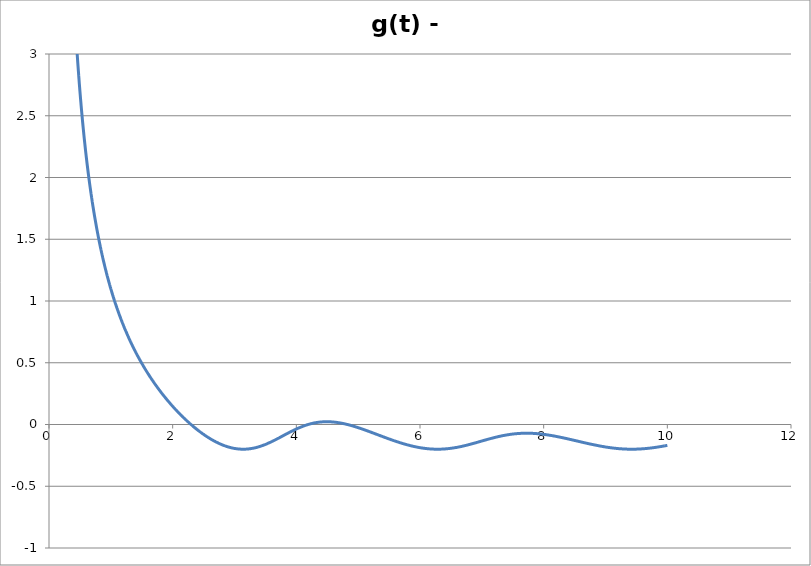
| Category | g(t) - 1/5 |
|---|---|
| 0.01 | 149.798 |
| 0.02 | 74.796 |
| 0.03 | 49.794 |
| 0.04 | 37.292 |
| 0.05 | 29.79 |
| 0.06 | 24.788 |
| 0.07 | 21.215 |
| 0.08 | 18.534 |
| 0.09 | 16.449 |
| 0.1 | 14.78 |
| 0.11 | 13.414 |
| 0.12 | 12.276 |
| 0.13 | 11.312 |
| 0.14 | 10.486 |
| 0.15 | 9.77 |
| 0.16 | 9.143 |
| 0.17 | 8.59 |
| 0.18 | 8.097 |
| 0.19 | 7.657 |
| 0.2 | 7.26 |
| 0.21 | 6.901 |
| 0.22 | 6.574 |
| 0.23 | 6.276 |
| 0.24 | 6.002 |
| 0.25 | 5.75 |
| 0.26 | 5.517 |
| 0.27 | 5.302 |
| 0.28 | 5.101 |
| 0.29 | 4.914 |
| 0.3 | 4.74 |
| 0.31 | 4.577 |
| 0.32 | 4.423 |
| 0.33 | 4.279 |
| 0.34 | 4.144 |
| 0.35 | 4.016 |
| 0.36 | 3.895 |
| 0.37 | 3.78 |
| 0.38 | 3.671 |
| 0.39 | 3.568 |
| 0.4 | 3.47 |
| 0.41 | 3.376 |
| 0.42 | 3.287 |
| 0.43 | 3.202 |
| 0.44 | 3.121 |
| 0.45 | 3.043 |
| 0.46 | 2.969 |
| 0.47 | 2.897 |
| 0.48 | 2.829 |
| 0.49 | 2.763 |
| 0.5 | 2.7 |
| 0.51 | 2.639 |
| 0.52 | 2.58 |
| 0.53 | 2.524 |
| 0.54 | 2.469 |
| 0.55 | 2.417 |
| 0.56 | 2.366 |
| 0.57 | 2.317 |
| 0.58 | 2.27 |
| 0.59 | 2.224 |
| 0.6 | 2.18 |
| 0.61 | 2.137 |
| 0.62 | 2.095 |
| 0.63 | 2.055 |
| 0.64 | 2.015 |
| 0.65 | 1.977 |
| 0.66 | 1.94 |
| 0.67 | 1.904 |
| 0.68 | 1.869 |
| 0.69 | 1.835 |
| 0.7 | 1.802 |
| 0.71 | 1.77 |
| 0.72 | 1.739 |
| 0.73 | 1.708 |
| 0.74 | 1.678 |
| 0.75 | 1.649 |
| 0.76 | 1.621 |
| 0.77 | 1.593 |
| 0.78 | 1.566 |
| 0.79 | 1.54 |
| 0.8 | 1.514 |
| 0.81 | 1.489 |
| 0.82 | 1.464 |
| 0.83 | 1.44 |
| 0.84 | 1.417 |
| 0.85 | 1.394 |
| 0.86 | 1.371 |
| 0.87 | 1.349 |
| 0.88 | 1.327 |
| 0.89 | 1.306 |
| 0.9 | 1.285 |
| 0.91 | 1.265 |
| 0.92 | 1.245 |
| 0.93 | 1.226 |
| 0.94 | 1.206 |
| 0.95 | 1.188 |
| 0.96 | 1.169 |
| 0.97 | 1.151 |
| 0.98 | 1.133 |
| 0.99 | 1.116 |
| 1.0 | 1.098 |
| 1.01 | 1.081 |
| 1.02 | 1.065 |
| 1.03 | 1.049 |
| 1.04 | 1.033 |
| 1.05 | 1.017 |
| 1.06 | 1.001 |
| 1.07 | 0.986 |
| 1.08 | 0.971 |
| 1.09 | 0.956 |
| 1.1 | 0.942 |
| 1.11 | 0.927 |
| 1.12 | 0.913 |
| 1.13 | 0.899 |
| 1.14 | 0.886 |
| 1.15 | 0.872 |
| 1.16 | 0.859 |
| 1.17 | 0.846 |
| 1.18 | 0.833 |
| 1.19 | 0.82 |
| 1.2 | 0.807 |
| 1.21 | 0.795 |
| 1.22 | 0.783 |
| 1.23 | 0.771 |
| 1.24 | 0.759 |
| 1.25 | 0.747 |
| 1.26 | 0.736 |
| 1.27 | 0.724 |
| 1.28 | 0.713 |
| 1.29 | 0.702 |
| 1.3 | 0.691 |
| 1.31 | 0.68 |
| 1.32 | 0.669 |
| 1.33 | 0.659 |
| 1.34 | 0.648 |
| 1.35 | 0.638 |
| 1.36 | 0.628 |
| 1.37 | 0.618 |
| 1.38 | 0.608 |
| 1.39 | 0.598 |
| 1.4 | 0.588 |
| 1.41 | 0.578 |
| 1.42 | 0.569 |
| 1.43 | 0.559 |
| 1.44 | 0.55 |
| 1.45 | 0.541 |
| 1.46 | 0.532 |
| 1.47 | 0.523 |
| 1.48 | 0.514 |
| 1.49 | 0.505 |
| 1.5 | 0.496 |
| 1.51 | 0.487 |
| 1.52 | 0.479 |
| 1.53 | 0.47 |
| 1.54 | 0.462 |
| 1.55 | 0.454 |
| 1.56 | 0.445 |
| 1.57 | 0.437 |
| 1.58 | 0.429 |
| 1.59 | 0.421 |
| 1.6 | 0.413 |
| 1.61 | 0.405 |
| 1.62 | 0.398 |
| 1.63 | 0.39 |
| 1.64 | 0.382 |
| 1.65 | 0.375 |
| 1.66 | 0.367 |
| 1.67 | 0.36 |
| 1.68 | 0.353 |
| 1.69 | 0.345 |
| 1.7 | 0.338 |
| 1.71 | 0.331 |
| 1.72 | 0.324 |
| 1.73 | 0.317 |
| 1.74 | 0.31 |
| 1.75 | 0.303 |
| 1.76 | 0.296 |
| 1.77 | 0.289 |
| 1.78 | 0.282 |
| 1.79 | 0.276 |
| 1.8 | 0.269 |
| 1.81 | 0.263 |
| 1.82 | 0.256 |
| 1.83 | 0.25 |
| 1.84 | 0.243 |
| 1.85 | 0.237 |
| 1.86 | 0.231 |
| 1.87 | 0.224 |
| 1.88 | 0.218 |
| 1.89 | 0.212 |
| 1.9 | 0.206 |
| 1.91 | 0.2 |
| 1.92 | 0.194 |
| 1.93 | 0.188 |
| 1.94 | 0.182 |
| 1.95 | 0.176 |
| 1.96 | 0.17 |
| 1.97 | 0.165 |
| 1.98 | 0.159 |
| 1.99 | 0.153 |
| 2.0 | 0.148 |
| 2.01 | 0.142 |
| 2.02 | 0.137 |
| 2.03 | 0.131 |
| 2.04 | 0.126 |
| 2.05 | 0.12 |
| 2.06 | 0.115 |
| 2.07 | 0.11 |
| 2.08 | 0.104 |
| 2.09 | 0.099 |
| 2.1 | 0.094 |
| 2.11 | 0.089 |
| 2.12 | 0.084 |
| 2.13 | 0.079 |
| 2.14 | 0.074 |
| 2.15 | 0.069 |
| 2.16 | 0.064 |
| 2.17 | 0.059 |
| 2.18 | 0.054 |
| 2.19 | 0.049 |
| 2.2 | 0.044 |
| 2.21 | 0.04 |
| 2.22 | 0.035 |
| 2.23 | 0.03 |
| 2.24 | 0.026 |
| 2.25 | 0.021 |
| 2.26 | 0.017 |
| 2.27 | 0.012 |
| 2.28 | 0.008 |
| 2.29 | 0.003 |
| 2.3 | -0.001 |
| 2.31 | -0.006 |
| 2.32 | -0.01 |
| 2.33 | -0.014 |
| 2.34 | -0.018 |
| 2.35 | -0.022 |
| 2.36 | -0.027 |
| 2.37 | -0.031 |
| 2.38 | -0.035 |
| 2.39 | -0.039 |
| 2.4 | -0.043 |
| 2.41 | -0.046 |
| 2.42 | -0.05 |
| 2.43 | -0.054 |
| 2.44 | -0.058 |
| 2.45 | -0.062 |
| 2.46 | -0.065 |
| 2.47 | -0.069 |
| 2.48 | -0.073 |
| 2.49 | -0.076 |
| 2.5 | -0.08 |
| 2.51 | -0.083 |
| 2.52 | -0.087 |
| 2.53 | -0.09 |
| 2.54 | -0.093 |
| 2.55 | -0.097 |
| 2.56 | -0.1 |
| 2.57 | -0.103 |
| 2.58 | -0.106 |
| 2.59 | -0.11 |
| 2.6 | -0.113 |
| 2.61 | -0.116 |
| 2.62 | -0.119 |
| 2.63 | -0.122 |
| 2.64 | -0.124 |
| 2.65 | -0.127 |
| 2.66 | -0.13 |
| 2.67 | -0.133 |
| 2.68 | -0.136 |
| 2.69 | -0.138 |
| 2.7 | -0.141 |
| 2.71 | -0.143 |
| 2.72 | -0.146 |
| 2.73 | -0.148 |
| 2.74 | -0.151 |
| 2.75 | -0.153 |
| 2.76 | -0.155 |
| 2.77 | -0.158 |
| 2.78 | -0.16 |
| 2.79 | -0.162 |
| 2.8 | -0.164 |
| 2.81 | -0.166 |
| 2.82 | -0.168 |
| 2.83 | -0.17 |
| 2.84 | -0.172 |
| 2.85 | -0.174 |
| 2.86 | -0.175 |
| 2.87 | -0.177 |
| 2.88 | -0.179 |
| 2.89 | -0.18 |
| 2.9 | -0.182 |
| 2.91 | -0.183 |
| 2.92 | -0.185 |
| 2.93 | -0.186 |
| 2.94 | -0.187 |
| 2.95 | -0.188 |
| 2.96 | -0.19 |
| 2.97 | -0.191 |
| 2.98 | -0.192 |
| 2.99 | -0.193 |
| 3.0 | -0.194 |
| 3.01 | -0.195 |
| 3.02 | -0.195 |
| 3.03 | -0.196 |
| 3.04 | -0.197 |
| 3.05 | -0.197 |
| 3.06 | -0.198 |
| 3.07 | -0.198 |
| 3.08 | -0.199 |
| 3.09 | -0.199 |
| 3.1 | -0.199 |
| 3.11 | -0.2 |
| 3.12 | -0.2 |
| 3.13 | -0.2 |
| 3.14 | -0.2 |
| 3.15 | -0.2 |
| 3.16 | -0.2 |
| 3.17 | -0.2 |
| 3.18 | -0.2 |
| 3.19 | -0.199 |
| 3.2 | -0.199 |
| 3.21 | -0.199 |
| 3.22 | -0.198 |
| 3.23 | -0.198 |
| 3.24 | -0.197 |
| 3.25 | -0.196 |
| 3.26 | -0.196 |
| 3.27 | -0.195 |
| 3.28 | -0.194 |
| 3.29 | -0.193 |
| 3.3 | -0.192 |
| 3.31 | -0.191 |
| 3.32 | -0.19 |
| 3.33 | -0.189 |
| 3.34 | -0.188 |
| 3.35 | -0.186 |
| 3.36 | -0.185 |
| 3.37 | -0.184 |
| 3.38 | -0.182 |
| 3.39 | -0.181 |
| 3.4 | -0.179 |
| 3.41 | -0.178 |
| 3.42 | -0.176 |
| 3.43 | -0.174 |
| 3.44 | -0.173 |
| 3.45 | -0.171 |
| 3.46 | -0.169 |
| 3.47 | -0.167 |
| 3.48 | -0.165 |
| 3.49 | -0.163 |
| 3.5 | -0.161 |
| 3.51 | -0.159 |
| 3.52 | -0.157 |
| 3.53 | -0.155 |
| 3.54 | -0.153 |
| 3.55 | -0.15 |
| 3.56 | -0.148 |
| 3.57 | -0.146 |
| 3.58 | -0.144 |
| 3.59 | -0.141 |
| 3.6 | -0.139 |
| 3.61 | -0.136 |
| 3.62 | -0.134 |
| 3.63 | -0.132 |
| 3.64 | -0.129 |
| 3.65 | -0.127 |
| 3.66 | -0.124 |
| 3.67 | -0.121 |
| 3.68 | -0.119 |
| 3.69 | -0.116 |
| 3.7 | -0.114 |
| 3.71 | -0.111 |
| 3.72 | -0.108 |
| 3.73 | -0.106 |
| 3.74 | -0.103 |
| 3.75 | -0.1 |
| 3.76 | -0.098 |
| 3.77 | -0.095 |
| 3.78 | -0.092 |
| 3.79 | -0.09 |
| 3.8 | -0.087 |
| 3.81 | -0.084 |
| 3.82 | -0.082 |
| 3.83 | -0.079 |
| 3.84 | -0.076 |
| 3.85 | -0.074 |
| 3.86 | -0.071 |
| 3.87 | -0.069 |
| 3.88 | -0.066 |
| 3.89 | -0.063 |
| 3.9 | -0.061 |
| 3.91 | -0.058 |
| 3.92 | -0.056 |
| 3.93 | -0.053 |
| 3.94 | -0.051 |
| 3.95 | -0.048 |
| 3.96 | -0.046 |
| 3.97 | -0.044 |
| 3.98 | -0.041 |
| 3.99 | -0.039 |
| 4.0 | -0.037 |
| 4.01 | -0.034 |
| 4.02 | -0.032 |
| 4.03 | -0.03 |
| 4.04 | -0.028 |
| 4.05 | -0.026 |
| 4.06 | -0.023 |
| 4.07 | -0.021 |
| 4.08 | -0.019 |
| 4.09 | -0.017 |
| 4.1 | -0.016 |
| 4.11 | -0.014 |
| 4.12 | -0.012 |
| 4.13 | -0.01 |
| 4.14 | -0.008 |
| 4.15 | -0.007 |
| 4.16 | -0.005 |
| 4.17 | -0.003 |
| 4.18 | -0.002 |
| 4.19 | 0 |
| 4.2 | 0.001 |
| 4.21 | 0.003 |
| 4.22 | 0.004 |
| 4.23 | 0.005 |
| 4.24 | 0.007 |
| 4.25 | 0.008 |
| 4.26 | 0.009 |
| 4.27 | 0.01 |
| 4.28 | 0.011 |
| 4.29 | 0.012 |
| 4.3 | 0.013 |
| 4.31 | 0.014 |
| 4.32 | 0.015 |
| 4.33 | 0.016 |
| 4.34 | 0.017 |
| 4.35 | 0.018 |
| 4.36 | 0.018 |
| 4.37 | 0.019 |
| 4.38 | 0.019 |
| 4.39 | 0.02 |
| 4.4 | 0.02 |
| 4.41 | 0.021 |
| 4.42 | 0.021 |
| 4.43 | 0.022 |
| 4.44 | 0.022 |
| 4.45 | 0.022 |
| 4.46 | 0.022 |
| 4.47 | 0.022 |
| 4.48 | 0.023 |
| 4.49 | 0.023 |
| 4.5 | 0.023 |
| 4.51 | 0.022 |
| 4.52 | 0.022 |
| 4.53 | 0.022 |
| 4.54 | 0.022 |
| 4.55 | 0.022 |
| 4.56 | 0.022 |
| 4.57 | 0.021 |
| 4.58 | 0.021 |
| 4.59 | 0.02 |
| 4.6 | 0.02 |
| 4.61 | 0.019 |
| 4.62 | 0.019 |
| 4.63 | 0.018 |
| 4.64 | 0.018 |
| 4.65 | 0.017 |
| 4.66 | 0.016 |
| 4.67 | 0.016 |
| 4.68 | 0.015 |
| 4.69 | 0.014 |
| 4.7 | 0.013 |
| 4.71 | 0.012 |
| 4.72 | 0.012 |
| 4.73 | 0.011 |
| 4.74 | 0.01 |
| 4.75 | 0.009 |
| 4.76 | 0.008 |
| 4.77 | 0.006 |
| 4.78 | 0.005 |
| 4.79 | 0.004 |
| 4.8 | 0.003 |
| 4.81 | 0.002 |
| 4.82 | 0.001 |
| 4.83 | -0.001 |
| 4.84 | -0.002 |
| 4.85 | -0.003 |
| 4.86 | -0.005 |
| 4.87 | -0.006 |
| 4.88 | -0.007 |
| 4.89 | -0.009 |
| 4.9 | -0.01 |
| 4.91 | -0.012 |
| 4.92 | -0.013 |
| 4.93 | -0.015 |
| 4.94 | -0.016 |
| 4.95 | -0.018 |
| 4.96 | -0.019 |
| 4.97 | -0.021 |
| 4.98 | -0.022 |
| 4.99 | -0.024 |
| 5.0 | -0.026 |
| 5.01 | -0.027 |
| 5.02 | -0.029 |
| 5.03 | -0.031 |
| 5.04 | -0.032 |
| 5.05 | -0.034 |
| 5.06 | -0.036 |
| 5.07 | -0.037 |
| 5.08 | -0.039 |
| 5.09 | -0.041 |
| 5.1 | -0.043 |
| 5.11 | -0.045 |
| 5.12 | -0.046 |
| 5.13 | -0.048 |
| 5.14 | -0.05 |
| 5.15 | -0.052 |
| 5.16 | -0.054 |
| 5.17 | -0.055 |
| 5.18 | -0.057 |
| 5.19 | -0.059 |
| 5.2 | -0.061 |
| 5.21 | -0.063 |
| 5.22 | -0.065 |
| 5.23 | -0.067 |
| 5.24 | -0.068 |
| 5.25 | -0.07 |
| 5.26 | -0.072 |
| 5.27 | -0.074 |
| 5.28 | -0.076 |
| 5.29 | -0.078 |
| 5.3 | -0.08 |
| 5.31 | -0.082 |
| 5.32 | -0.084 |
| 5.33 | -0.085 |
| 5.34 | -0.087 |
| 5.35 | -0.089 |
| 5.36 | -0.091 |
| 5.37 | -0.093 |
| 5.38 | -0.095 |
| 5.39 | -0.097 |
| 5.4 | -0.099 |
| 5.41 | -0.1 |
| 5.42 | -0.102 |
| 5.43 | -0.104 |
| 5.44 | -0.106 |
| 5.45 | -0.108 |
| 5.46 | -0.11 |
| 5.47 | -0.112 |
| 5.48 | -0.113 |
| 5.49 | -0.115 |
| 5.5 | -0.117 |
| 5.51 | -0.119 |
| 5.52 | -0.121 |
| 5.53 | -0.122 |
| 5.54 | -0.124 |
| 5.55 | -0.126 |
| 5.56 | -0.128 |
| 5.57 | -0.129 |
| 5.58 | -0.131 |
| 5.59 | -0.133 |
| 5.6 | -0.135 |
| 5.61 | -0.136 |
| 5.62 | -0.138 |
| 5.63 | -0.14 |
| 5.64 | -0.141 |
| 5.65 | -0.143 |
| 5.66 | -0.144 |
| 5.67 | -0.146 |
| 5.68 | -0.148 |
| 5.69 | -0.149 |
| 5.7 | -0.151 |
| 5.71 | -0.152 |
| 5.72 | -0.154 |
| 5.73 | -0.155 |
| 5.74 | -0.157 |
| 5.75 | -0.158 |
| 5.76 | -0.16 |
| 5.77 | -0.161 |
| 5.78 | -0.163 |
| 5.79 | -0.164 |
| 5.8 | -0.165 |
| 5.81 | -0.167 |
| 5.82 | -0.168 |
| 5.83 | -0.169 |
| 5.84 | -0.17 |
| 5.85 | -0.172 |
| 5.86 | -0.173 |
| 5.87 | -0.174 |
| 5.88 | -0.175 |
| 5.89 | -0.176 |
| 5.9 | -0.178 |
| 5.91 | -0.179 |
| 5.92 | -0.18 |
| 5.93 | -0.181 |
| 5.94 | -0.182 |
| 5.95 | -0.183 |
| 5.96 | -0.184 |
| 5.97 | -0.185 |
| 5.98 | -0.186 |
| 5.99 | -0.187 |
| 6.0 | -0.188 |
| 6.01 | -0.188 |
| 6.02 | -0.189 |
| 6.03 | -0.19 |
| 6.04 | -0.191 |
| 6.05 | -0.191 |
| 6.06 | -0.192 |
| 6.07 | -0.193 |
| 6.08 | -0.194 |
| 6.09 | -0.194 |
| 6.1 | -0.195 |
| 6.11 | -0.195 |
| 6.12 | -0.196 |
| 6.13 | -0.196 |
| 6.14 | -0.197 |
| 6.15 | -0.197 |
| 6.16 | -0.198 |
| 6.17 | -0.198 |
| 6.18 | -0.198 |
| 6.19 | -0.199 |
| 6.2 | -0.199 |
| 6.21 | -0.199 |
| 6.22 | -0.199 |
| 6.23 | -0.2 |
| 6.24 | -0.2 |
| 6.25 | -0.2 |
| 6.26 | -0.2 |
| 6.27 | -0.2 |
| 6.28 | -0.2 |
| 6.29 | -0.2 |
| 6.3 | -0.2 |
| 6.31 | -0.2 |
| 6.32 | -0.2 |
| 6.33 | -0.2 |
| 6.34 | -0.199 |
| 6.35 | -0.199 |
| 6.36 | -0.199 |
| 6.37 | -0.199 |
| 6.38 | -0.199 |
| 6.39 | -0.198 |
| 6.4 | -0.198 |
| 6.41 | -0.197 |
| 6.42 | -0.197 |
| 6.43 | -0.197 |
| 6.44 | -0.196 |
| 6.45 | -0.196 |
| 6.46 | -0.195 |
| 6.47 | -0.195 |
| 6.48 | -0.194 |
| 6.49 | -0.193 |
| 6.5 | -0.193 |
| 6.51 | -0.192 |
| 6.52 | -0.191 |
| 6.53 | -0.191 |
| 6.54 | -0.19 |
| 6.55 | -0.189 |
| 6.56 | -0.188 |
| 6.57 | -0.187 |
| 6.58 | -0.186 |
| 6.59 | -0.186 |
| 6.6 | -0.185 |
| 6.61 | -0.184 |
| 6.62 | -0.183 |
| 6.63 | -0.182 |
| 6.64 | -0.181 |
| 6.65 | -0.18 |
| 6.66 | -0.179 |
| 6.67 | -0.177 |
| 6.68 | -0.176 |
| 6.69 | -0.175 |
| 6.7 | -0.174 |
| 6.71 | -0.173 |
| 6.72 | -0.172 |
| 6.73 | -0.171 |
| 6.74 | -0.169 |
| 6.75 | -0.168 |
| 6.76 | -0.167 |
| 6.77 | -0.166 |
| 6.78 | -0.164 |
| 6.79 | -0.163 |
| 6.8 | -0.162 |
| 6.81 | -0.16 |
| 6.82 | -0.159 |
| 6.83 | -0.158 |
| 6.84 | -0.156 |
| 6.85 | -0.155 |
| 6.86 | -0.154 |
| 6.87 | -0.152 |
| 6.88 | -0.151 |
| 6.89 | -0.149 |
| 6.9 | -0.148 |
| 6.91 | -0.147 |
| 6.92 | -0.145 |
| 6.93 | -0.144 |
| 6.94 | -0.142 |
| 6.95 | -0.141 |
| 6.96 | -0.139 |
| 6.97 | -0.138 |
| 6.98 | -0.137 |
| 6.99 | -0.135 |
| 7.0 | -0.134 |
| 7.01 | -0.132 |
| 7.02 | -0.131 |
| 7.03 | -0.129 |
| 7.04 | -0.128 |
| 7.05 | -0.127 |
| 7.06 | -0.125 |
| 7.07 | -0.124 |
| 7.08 | -0.122 |
| 7.09 | -0.121 |
| 7.1 | -0.119 |
| 7.11 | -0.118 |
| 7.12 | -0.117 |
| 7.13 | -0.115 |
| 7.14 | -0.114 |
| 7.15 | -0.113 |
| 7.16 | -0.111 |
| 7.17 | -0.11 |
| 7.18 | -0.109 |
| 7.19 | -0.107 |
| 7.2 | -0.106 |
| 7.21 | -0.105 |
| 7.22 | -0.104 |
| 7.23 | -0.103 |
| 7.24 | -0.101 |
| 7.25 | -0.1 |
| 7.26 | -0.099 |
| 7.27 | -0.098 |
| 7.28 | -0.097 |
| 7.29 | -0.096 |
| 7.3 | -0.094 |
| 7.31 | -0.093 |
| 7.32 | -0.092 |
| 7.33 | -0.091 |
| 7.34 | -0.09 |
| 7.35 | -0.089 |
| 7.36 | -0.088 |
| 7.37 | -0.087 |
| 7.38 | -0.086 |
| 7.39 | -0.086 |
| 7.4 | -0.085 |
| 7.41 | -0.084 |
| 7.42 | -0.083 |
| 7.43 | -0.082 |
| 7.44 | -0.081 |
| 7.45 | -0.081 |
| 7.46 | -0.08 |
| 7.47 | -0.079 |
| 7.48 | -0.079 |
| 7.49 | -0.078 |
| 7.5 | -0.077 |
| 7.51 | -0.077 |
| 7.52 | -0.076 |
| 7.53 | -0.076 |
| 7.54 | -0.075 |
| 7.55 | -0.075 |
| 7.56 | -0.074 |
| 7.57 | -0.074 |
| 7.58 | -0.073 |
| 7.59 | -0.073 |
| 7.6 | -0.073 |
| 7.61 | -0.072 |
| 7.62 | -0.072 |
| 7.63 | -0.072 |
| 7.64 | -0.072 |
| 7.65 | -0.071 |
| 7.66 | -0.071 |
| 7.67 | -0.071 |
| 7.68 | -0.071 |
| 7.69 | -0.071 |
| 7.7 | -0.071 |
| 7.71 | -0.071 |
| 7.72 | -0.071 |
| 7.73 | -0.071 |
| 7.74 | -0.071 |
| 7.75 | -0.071 |
| 7.76 | -0.071 |
| 7.77 | -0.071 |
| 7.78 | -0.071 |
| 7.79 | -0.071 |
| 7.8 | -0.071 |
| 7.81 | -0.071 |
| 7.82 | -0.072 |
| 7.83 | -0.072 |
| 7.84 | -0.072 |
| 7.85 | -0.073 |
| 7.86 | -0.073 |
| 7.87 | -0.073 |
| 7.88 | -0.074 |
| 7.89 | -0.074 |
| 7.9 | -0.074 |
| 7.91 | -0.075 |
| 7.92 | -0.075 |
| 7.93 | -0.076 |
| 7.94 | -0.076 |
| 7.95 | -0.077 |
| 7.96 | -0.077 |
| 7.97 | -0.078 |
| 7.98 | -0.079 |
| 7.99 | -0.079 |
| 8.0 | -0.08 |
| 8.01 | -0.08 |
| 8.02 | -0.081 |
| 8.03 | -0.082 |
| 8.04 | -0.083 |
| 8.05 | -0.083 |
| 8.06 | -0.084 |
| 8.07 | -0.085 |
| 8.08 | -0.086 |
| 8.09 | -0.086 |
| 8.1 | -0.087 |
| 8.11 | -0.088 |
| 8.12 | -0.089 |
| 8.13 | -0.09 |
| 8.14 | -0.091 |
| 8.15 | -0.091 |
| 8.16 | -0.092 |
| 8.17 | -0.093 |
| 8.18 | -0.094 |
| 8.19 | -0.095 |
| 8.2 | -0.096 |
| 8.21 | -0.097 |
| 8.22 | -0.098 |
| 8.23 | -0.099 |
| 8.24 | -0.1 |
| 8.25 | -0.101 |
| 8.26 | -0.102 |
| 8.27 | -0.103 |
| 8.28 | -0.104 |
| 8.29 | -0.105 |
| 8.3 | -0.106 |
| 8.31 | -0.107 |
| 8.32 | -0.108 |
| 8.33 | -0.11 |
| 8.34 | -0.111 |
| 8.35 | -0.112 |
| 8.36 | -0.113 |
| 8.37 | -0.114 |
| 8.38 | -0.115 |
| 8.39 | -0.116 |
| 8.4 | -0.117 |
| 8.41 | -0.119 |
| 8.42 | -0.12 |
| 8.43 | -0.121 |
| 8.44 | -0.122 |
| 8.45 | -0.123 |
| 8.46 | -0.124 |
| 8.47 | -0.125 |
| 8.48 | -0.127 |
| 8.49 | -0.128 |
| 8.5 | -0.129 |
| 8.51 | -0.13 |
| 8.52 | -0.131 |
| 8.53 | -0.133 |
| 8.54 | -0.134 |
| 8.55 | -0.135 |
| 8.56 | -0.136 |
| 8.57 | -0.137 |
| 8.58 | -0.138 |
| 8.59 | -0.14 |
| 8.6 | -0.141 |
| 8.61 | -0.142 |
| 8.62 | -0.143 |
| 8.63 | -0.144 |
| 8.64 | -0.145 |
| 8.65 | -0.147 |
| 8.66 | -0.148 |
| 8.67 | -0.149 |
| 8.68 | -0.15 |
| 8.69 | -0.151 |
| 8.7 | -0.152 |
| 8.71 | -0.153 |
| 8.72 | -0.154 |
| 8.73 | -0.156 |
| 8.74 | -0.157 |
| 8.75 | -0.158 |
| 8.76 | -0.159 |
| 8.77 | -0.16 |
| 8.78 | -0.161 |
| 8.79 | -0.162 |
| 8.8 | -0.163 |
| 8.81 | -0.164 |
| 8.82 | -0.165 |
| 8.83 | -0.166 |
| 8.84 | -0.167 |
| 8.85 | -0.168 |
| 8.86 | -0.169 |
| 8.87 | -0.17 |
| 8.88 | -0.171 |
| 8.89 | -0.172 |
| 8.9 | -0.173 |
| 8.91 | -0.174 |
| 8.92 | -0.175 |
| 8.93 | -0.176 |
| 8.94 | -0.177 |
| 8.95 | -0.178 |
| 8.96 | -0.179 |
| 8.97 | -0.179 |
| 8.98 | -0.18 |
| 8.99 | -0.181 |
| 9.0 | -0.182 |
| 9.01 | -0.183 |
| 9.02 | -0.183 |
| 9.03 | -0.184 |
| 9.04 | -0.185 |
| 9.05 | -0.186 |
| 9.06 | -0.186 |
| 9.07 | -0.187 |
| 9.08 | -0.188 |
| 9.09 | -0.189 |
| 9.1 | -0.189 |
| 9.11 | -0.19 |
| 9.12 | -0.19 |
| 9.13 | -0.191 |
| 9.14 | -0.192 |
| 9.15 | -0.192 |
| 9.16 | -0.193 |
| 9.17 | -0.193 |
| 9.18 | -0.194 |
| 9.19 | -0.194 |
| 9.2 | -0.195 |
| 9.21 | -0.195 |
| 9.22 | -0.196 |
| 9.23 | -0.196 |
| 9.24 | -0.196 |
| 9.25 | -0.197 |
| 9.26 | -0.197 |
| 9.27 | -0.197 |
| 9.28 | -0.198 |
| 9.29 | -0.198 |
| 9.3 | -0.198 |
| 9.31 | -0.199 |
| 9.32 | -0.199 |
| 9.33 | -0.199 |
| 9.34 | -0.199 |
| 9.35 | -0.199 |
| 9.36 | -0.2 |
| 9.37 | -0.2 |
| 9.38 | -0.2 |
| 9.39 | -0.2 |
| 9.4 | -0.2 |
| 9.41 | -0.2 |
| 9.42 | -0.2 |
| 9.43 | -0.2 |
| 9.44 | -0.2 |
| 9.45 | -0.2 |
| 9.46 | -0.2 |
| 9.47 | -0.2 |
| 9.48 | -0.2 |
| 9.49 | -0.2 |
| 9.5 | -0.199 |
| 9.51 | -0.199 |
| 9.52 | -0.199 |
| 9.53 | -0.199 |
| 9.54 | -0.199 |
| 9.55 | -0.198 |
| 9.56 | -0.198 |
| 9.57 | -0.198 |
| 9.58 | -0.197 |
| 9.59 | -0.197 |
| 9.6 | -0.197 |
| 9.61 | -0.196 |
| 9.62 | -0.196 |
| 9.63 | -0.196 |
| 9.64 | -0.195 |
| 9.65 | -0.195 |
| 9.66 | -0.194 |
| 9.67 | -0.194 |
| 9.68 | -0.193 |
| 9.69 | -0.193 |
| 9.7 | -0.192 |
| 9.71 | -0.192 |
| 9.72 | -0.191 |
| 9.73 | -0.19 |
| 9.74 | -0.19 |
| 9.75 | -0.189 |
| 9.76 | -0.189 |
| 9.77 | -0.188 |
| 9.78 | -0.187 |
| 9.79 | -0.187 |
| 9.8 | -0.186 |
| 9.81 | -0.185 |
| 9.82 | -0.184 |
| 9.83 | -0.184 |
| 9.84 | -0.183 |
| 9.85 | -0.182 |
| 9.86 | -0.181 |
| 9.87 | -0.18 |
| 9.88 | -0.18 |
| 9.89 | -0.179 |
| 9.9 | -0.178 |
| 9.91 | -0.177 |
| 9.92 | -0.176 |
| 9.93 | -0.175 |
| 9.94 | -0.174 |
| 9.95 | -0.174 |
| 9.96 | -0.173 |
| 9.97 | -0.172 |
| 9.98 | -0.171 |
| 9.99 | -0.17 |
| 10.0 | -0.169 |